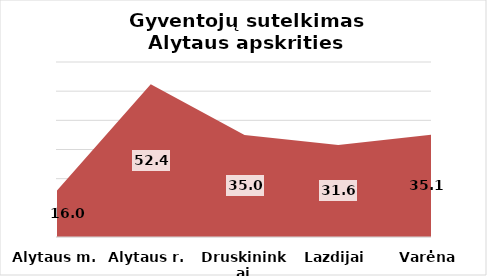
| Category | Series 0 |
|---|---|
| Alytaus m. | 15.962 |
| Alytaus r. | 52.408 |
| Druskininkai | 34.993 |
| Lazdijai | 31.557 |
| Varėna | 35.072 |